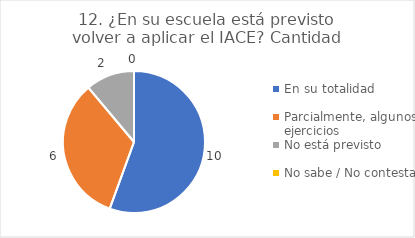
| Category | 12. ¿En su escuela está previsto volver a aplicar el IACE? |
|---|---|
| En su totalidad  | 0.556 |
| Parcialmente, algunos ejercicios  | 0.333 |
| No está previsto  | 0.111 |
| No sabe / No contesta | 0 |